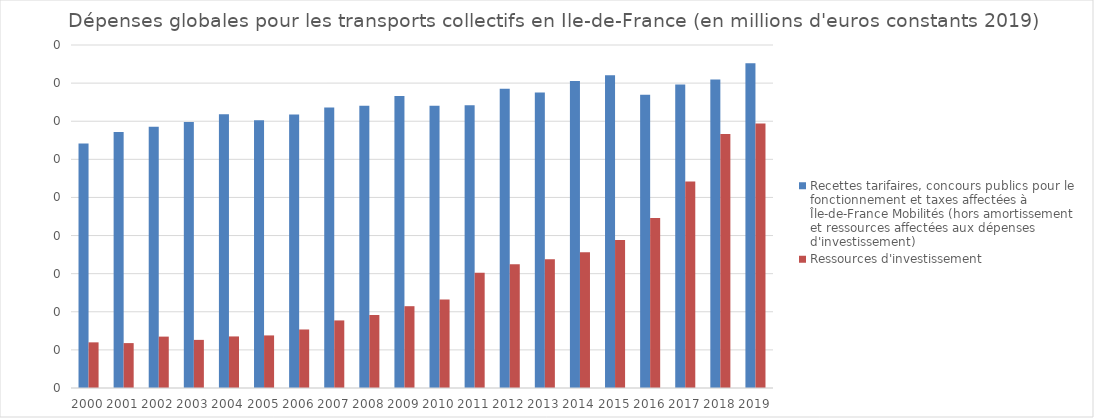
| Category | Recettes tarifaires, concours publics pour le fonctionnement et taxes affectées à Île-de-France Mobilités (hors amortissement et ressources affectées aux dépenses d'investissement) | Ressources d'investissement |
|---|---|---|
| 2000.0 | 6418333824.294 | 1197797740.365 |
| 2001.0 | 6717439683.964 | 1178161239.084 |
| 2002.0 | 6857610751.758 | 1348466159.215 |
| 2003.0 | 6980915178.907 | 1262691674.058 |
| 2004.0 | 7181744670.809 | 1353014846.82 |
| 2005.0 | 7026922327.776 | 1379637596.151 |
| 2006.0 | 7178017806.368 | 1535522004.977 |
| 2007.0 | 7358671585.357 | 1773165509.562 |
| 2008.0 | 7406584313.8 | 1915541092.859 |
| 2009.0 | 7663674565.692 | 2146470474.878 |
| 2010.0 | 7407065332.861 | 2322260835.903 |
| 2011.0 | 7418831953.498 | 3025504970.502 |
| 2012.0 | 7850579461.925 | 3244678839.992 |
| 2013.0 | 7756228548.392 | 3375119062.591 |
| 2014.0 | 8054186778.909 | 3560217788.499 |
| 2015.0 | 8208652234.749 | 3884700680.514 |
| 2016.0 | 7697391843.444 | 4463471405.228 |
| 2017.0 | 7966002456.364 | 5419854807.217 |
| 2018.0 | 8092570344.173 | 6667675440.736 |
| 2019.0 | 8521370721.375 | 6942535121.204 |